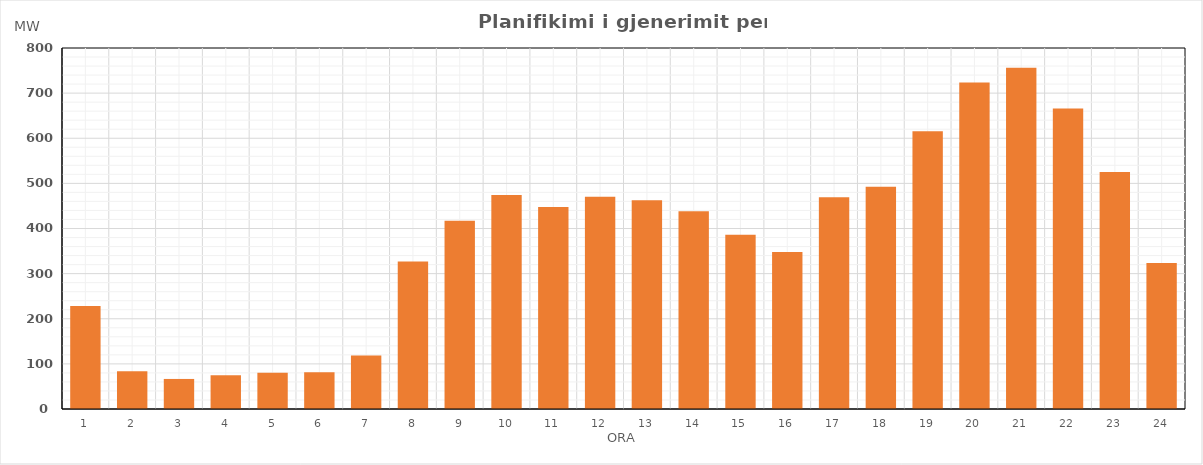
| Category | Max (MW) |
|---|---|
| 0 | 228.385 |
| 1 | 83.645 |
| 2 | 66.59 |
| 3 | 74.575 |
| 4 | 80.515 |
| 5 | 81.449 |
| 6 | 118.619 |
| 7 | 326.633 |
| 8 | 417.4 |
| 9 | 474.49 |
| 10 | 447.4 |
| 11 | 470.46 |
| 12 | 462.393 |
| 13 | 438.337 |
| 14 | 386.08 |
| 15 | 347.886 |
| 16 | 469.46 |
| 17 | 492.55 |
| 18 | 615.745 |
| 19 | 723.78 |
| 20 | 756.4 |
| 21 | 665.821 |
| 22 | 525.345 |
| 23 | 323.75 |